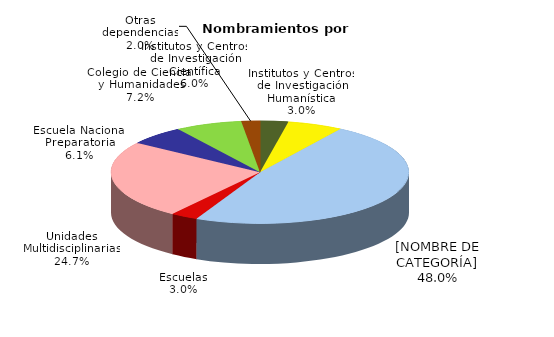
| Category | Series 0 |
|---|---|
| Institutos y Centros de Investigación Humanística | 1580 |
| Institutos y Centros de Investigación Científica | 3131 |
| Facultades | 24889 |
| Escuelas | 1549 |
| Unidades Multidisciplinarias | 12822 |
| Escuela Nacional Preparatoria | 3178 |
| Colegio de Ciencias y Humanidades | 3753 |
| Otras dependencias | 1041 |